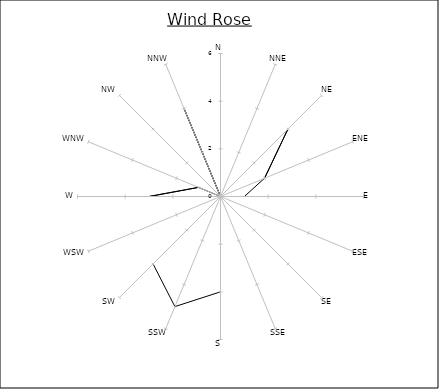
| Category | Series 0 |
|---|---|
| N | 0 |
| NNE | 0 |
| NE | 4 |
| ENE | 2 |
| E | 1 |
| ESE | 0 |
| SE | 0 |
| SSE | 0 |
| S | 4 |
| SSW | 5 |
| SW | 4 |
| WSW | 0 |
| W | 3 |
| WNW | 1 |
| NW | 0 |
| NNW | 4 |